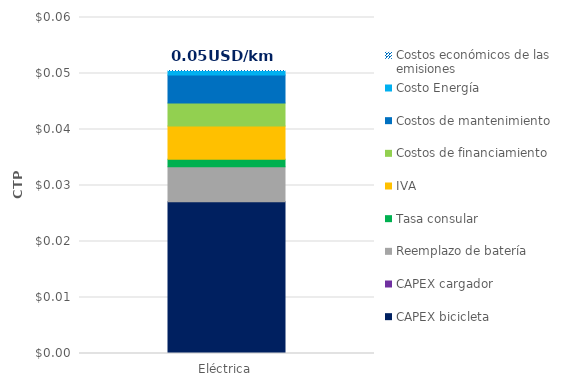
| Category | CAPEX bicicleta | CAPEX cargador | Reemplazo de batería | Tasa consular | IVA | Costos de financiamiento | Costos de mantenimiento | Costo Energía | Costos económicos de las emisiones |
|---|---|---|---|---|---|---|---|---|---|
| Eléctrica | 0.027 | 0 | 0.006 | 0.001 | 0.006 | 0.004 | 0.005 | 0.001 | 0 |